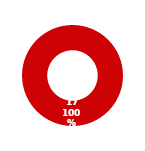
| Category | RISK |
|---|---|
| MIL 2 Complete | 0 |
| MIL 2 Not Complete | 17 |